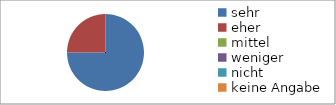
| Category | Series 0 |
|---|---|
| sehr | 12 |
| eher | 4 |
| mittel | 0 |
| weniger | 0 |
| nicht | 0 |
| keine Angabe | 0 |